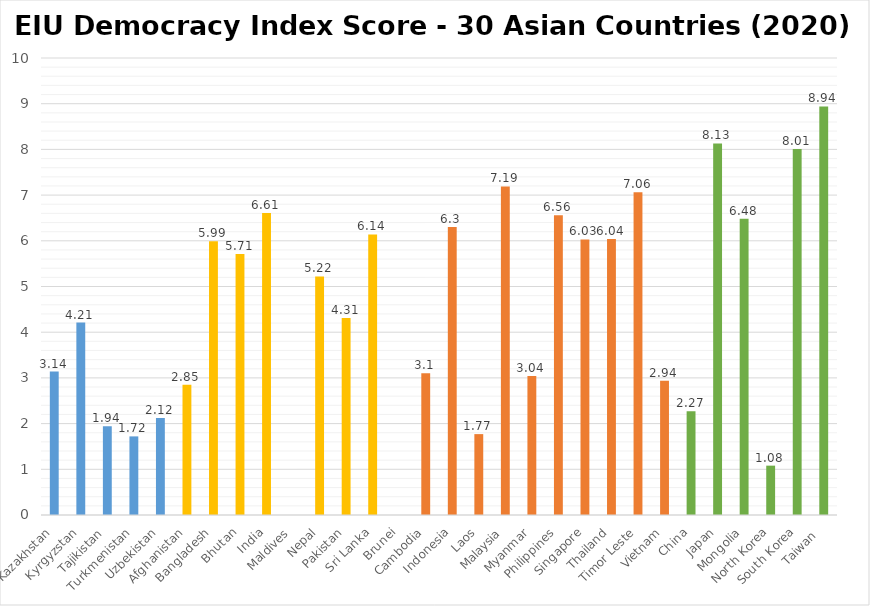
| Category | Democracy Index |
|---|---|
| Kazakhstan | 3.14 |
| Kyrgyzstan | 4.21 |
| Tajikistan | 1.94 |
| Turkmenistan | 1.72 |
| Uzbekistan | 2.12 |
| Afghanistan | 2.85 |
| Bangladesh | 5.99 |
| Bhutan | 5.71 |
| India | 6.61 |
| Maldives | 0 |
| Nepal | 5.22 |
| Pakistan | 4.31 |
| Sri Lanka | 6.14 |
| Brunei | 0 |
| Cambodia | 3.1 |
| Indonesia | 6.3 |
| Laos | 1.77 |
| Malaysia | 7.19 |
| Myanmar | 3.04 |
| Philippines | 6.56 |
| Singapore | 6.03 |
| Thailand | 6.04 |
| Timor Leste | 7.06 |
| Vietnam | 2.94 |
| China | 2.27 |
| Japan | 8.13 |
| Mongolia | 6.48 |
| North Korea | 1.08 |
| South Korea | 8.01 |
| Taiwan  | 8.94 |